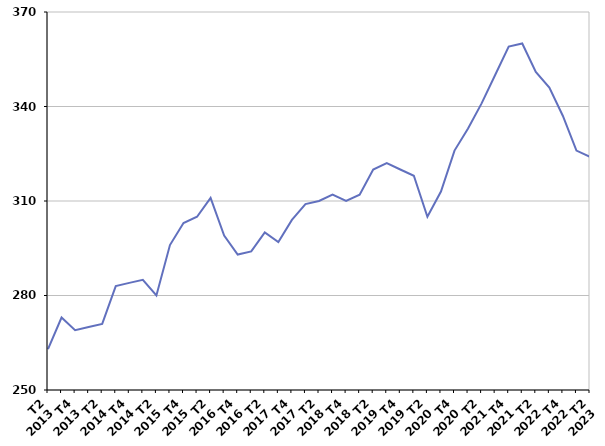
| Category | Durée moyenne d'inscription sur les listes des sortants |
|---|---|
| T2
2013 | 263 |
| T3
2013 | 273 |
| T4
2013 | 269 |
| T1
2014 | 270 |
| T2
2014 | 271 |
| T3
2014 | 283 |
| T4
2014 | 284 |
| T1
2015 | 285 |
| T2
2015 | 280 |
| T3
2015 | 296 |
| T4
2015 | 303 |
| T1
2016 | 305 |
| T2
2016 | 311 |
| T3
2016 | 299 |
| T4
2016 | 293 |
| T1
2017 | 294 |
| T2
2017 | 300 |
| T3
2017 | 297 |
| T4
2017 | 304 |
| T1
2018 | 309 |
| T2
2018 | 310 |
| T3
2018 | 312 |
| T4
2018 | 310 |
| T1
2019 | 312 |
| T2
2019 | 320 |
| T3
2019 | 322 |
| T4
2019 | 320 |
| T1
2020 | 318 |
| T2
2020 | 305 |
| T3
2020 | 313 |
| T4
2020 | 326 |
| T1
2021 | 333 |
| T2
2021 | 341 |
| T3
2021 | 350 |
| T4
2021 | 359 |
| T1
2022 | 360 |
| T2
2022 | 351 |
| T3
2022 | 346 |
| T4
2022 | 337 |
| T1
2023 | 326 |
| T2
2023 | 324 |